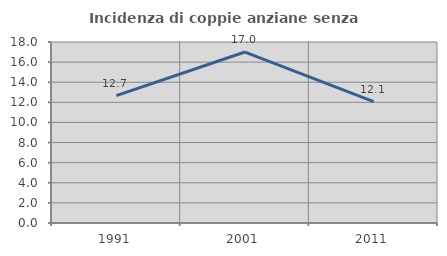
| Category | Incidenza di coppie anziane senza figli  |
|---|---|
| 1991.0 | 12.667 |
| 2001.0 | 17.003 |
| 2011.0 | 12.079 |